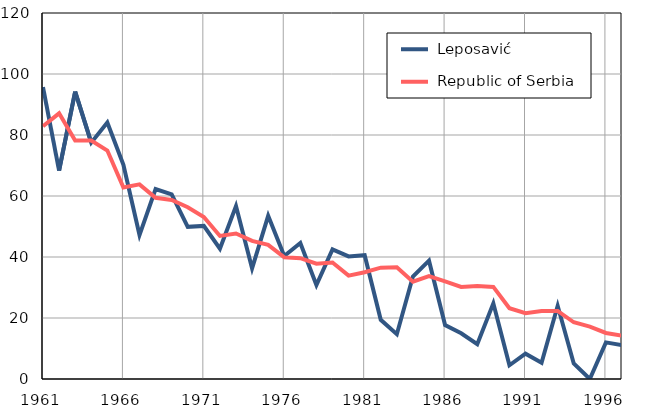
| Category |  Leposavić |  Republic of Serbia |
|---|---|---|
| 1961.0 | 95.7 | 82.9 |
| 1962.0 | 68.3 | 87.1 |
| 1963.0 | 94.2 | 78.2 |
| 1964.0 | 77.5 | 78.2 |
| 1965.0 | 84.1 | 74.9 |
| 1966.0 | 70.2 | 62.8 |
| 1967.0 | 47.2 | 63.8 |
| 1968.0 | 62.3 | 59.4 |
| 1969.0 | 60.5 | 58.7 |
| 1970.0 | 49.9 | 56.3 |
| 1971.0 | 50.2 | 53.1 |
| 1972.0 | 42.7 | 46.9 |
| 1973.0 | 56.7 | 47.7 |
| 1974.0 | 36.3 | 45.3 |
| 1975.0 | 53.5 | 44 |
| 1976.0 | 40.3 | 39.9 |
| 1977.0 | 44.6 | 39.6 |
| 1978.0 | 30.8 | 37.8 |
| 1979.0 | 42.5 | 38.2 |
| 1980.0 | 40.2 | 33.9 |
| 1981.0 | 40.6 | 35 |
| 1982.0 | 19.4 | 36.5 |
| 1983.0 | 14.7 | 36.6 |
| 1984.0 | 33.6 | 31.9 |
| 1985.0 | 38.8 | 33.7 |
| 1986.0 | 17.7 | 32 |
| 1987.0 | 15 | 30.2 |
| 1988.0 | 11.4 | 30.5 |
| 1989.0 | 24.8 | 30.2 |
| 1990.0 | 4.5 | 23.2 |
| 1991.0 | 8.3 | 21.6 |
| 1992.0 | 5.3 | 22.3 |
| 1993.0 | 24 | 22.3 |
| 1994.0 | 5.1 | 18.6 |
| 1995.0 | 0 | 17.2 |
| 1996.0 | 12 | 15.1 |
| 1997.0 | 11.1 | 14.2 |